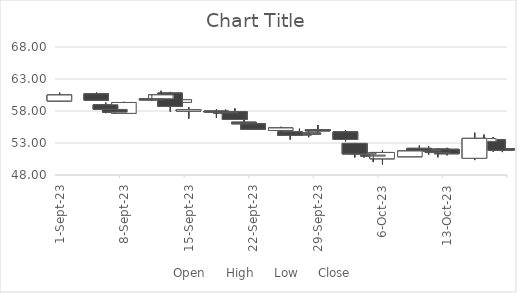
| Category | Open | High | Low | Close |
|---|---|---|---|---|
| 2023-10-19 | 52.1 | 52.5 | 51.58 | 51.9 |
| 2023-10-18 | 53.5 | 53.91 | 51.66 | 51.84 |
| 2023-10-17 | 53.25 | 54.31 | 52.07 | 53.69 |
| 2023-10-16 | 50.61 | 54.6 | 50.33 | 53.72 |
| 2023-10-13 | 52.01 | 52.24 | 51.08 | 51.33 |
| 2023-10-12 | 52.03 | 52.13 | 50.77 | 51.51 |
| 2023-10-11 | 51.87 | 52.49 | 51.12 | 51.91 |
| 2023-10-10 | 52.16 | 52.59 | 51.71 | 51.78 |
| 2023-10-09 | 50.86 | 51.78 | 50.84 | 51.75 |
| 2023-10-06 | 50.54 | 51.85 | 49.66 | 51.52 |
| 2023-10-05 | 51.11 | 51.41 | 50.02 | 51.06 |
| 2023-10-04 | 51.26 | 51.58 | 50.74 | 51.41 |
| 2023-10-03 | 52.93 | 53.01 | 50.75 | 51.3 |
| 2023-10-02 | 54.74 | 54.96 | 53.27 | 53.55 |
| 2023-09-29 | 55.1 | 55.81 | 54.64 | 54.9 |
| 2023-09-28 | 54.52 | 54.78 | 53.91 | 54.55 |
| 2023-09-27 | 54.43 | 55.23 | 54.12 | 54.38 |
| 2023-09-26 | 54.74 | 54.98 | 53.53 | 54.2 |
| 2023-09-25 | 54.96 | 55.53 | 54.56 | 55.35 |
| 2023-09-22 | 56 | 56.2 | 55.12 | 55.15 |
| 2023-09-21 | 56.24 | 56.85 | 55.95 | 56.01 |
| 2023-09-20 | 57.91 | 58.39 | 56.63 | 56.67 |
| 2023-09-19 | 57.84 | 58.2 | 57.39 | 57.73 |
| 2023-09-18 | 57.99 | 58.25 | 56.94 | 57.86 |
| 2023-09-15 | 58 | 58.62 | 56.82 | 58.22 |
| 2023-09-14 | 59.35 | 59.93 | 59.07 | 59.76 |
| 2023-09-13 | 60.8 | 60.98 | 57.9 | 58.73 |
| 2023-09-12 | 59.91 | 61.15 | 59.81 | 60.52 |
| 2023-09-11 | 59.89 | 60.59 | 59.62 | 59.82 |
| 2023-09-08 | 57.63 | 59.43 | 57.58 | 59.33 |
| 2023-09-07 | 58.25 | 58.6 | 57.62 | 57.82 |
| 2023-09-06 | 58.97 | 59.3 | 57.67 | 58.27 |
| 2023-09-05 | 60.7 | 60.96 | 59.63 | 59.68 |
| 2023-09-01 | 59.57 | 60.86 | 59.5 | 60.5 |